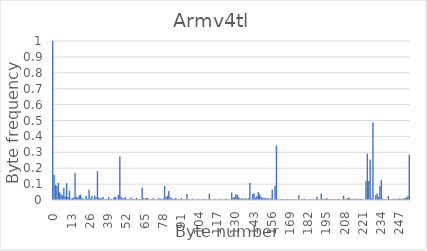
| Category | Series 0 |
|---|---|
| 0.0 | 1 |
| 1.0 | 0.159 |
| 2.0 | 0.095 |
| 3.0 | 0.088 |
| 4.0 | 0.109 |
| 5.0 | 0.049 |
| 6.0 | 0.037 |
| 7.0 | 0.03 |
| 8.0 | 0.077 |
| 9.0 | 0.022 |
| 10.0 | 0.106 |
| 11.0 | 0.02 |
| 12.0 | 0.058 |
| 13.0 | 0.008 |
| 14.0 | 0.012 |
| 15.0 | 0.015 |
| 16.0 | 0.17 |
| 17.0 | 0.021 |
| 18.0 | 0.014 |
| 19.0 | 0.03 |
| 20.0 | 0.033 |
| 21.0 | 0.014 |
| 22.0 | 0.006 |
| 23.0 | 0.006 |
| 24.0 | 0.025 |
| 25.0 | 0.007 |
| 26.0 | 0.064 |
| 27.0 | 0.01 |
| 28.0 | 0.025 |
| 29.0 | 0.005 |
| 30.0 | 0.028 |
| 31.0 | 0.018 |
| 32.0 | 0.181 |
| 33.0 | 0.017 |
| 34.0 | 0.01 |
| 35.0 | 0.01 |
| 36.0 | 0.021 |
| 37.0 | 0.005 |
| 38.0 | 0.005 |
| 39.0 | 0.005 |
| 40.0 | 0.019 |
| 41.0 | 0.005 |
| 42.0 | 0.008 |
| 43.0 | 0.004 |
| 44.0 | 0.019 |
| 45.0 | 0.019 |
| 46.0 | 0.005 |
| 47.0 | 0.033 |
| 48.0 | 0.274 |
| 49.0 | 0.021 |
| 50.0 | 0.011 |
| 51.0 | 0.012 |
| 52.0 | 0.018 |
| 53.0 | 0.006 |
| 54.0 | 0.005 |
| 55.0 | 0.005 |
| 56.0 | 0.016 |
| 57.0 | 0.004 |
| 58.0 | 0.007 |
| 59.0 | 0.004 |
| 60.0 | 0.014 |
| 61.0 | 0.004 |
| 62.0 | 0.005 |
| 63.0 | 0.006 |
| 64.0 | 0.079 |
| 65.0 | 0.011 |
| 66.0 | 0.007 |
| 67.0 | 0.012 |
| 68.0 | 0.012 |
| 69.0 | 0.005 |
| 70.0 | 0.004 |
| 71.0 | 0.006 |
| 72.0 | 0.011 |
| 73.0 | 0.003 |
| 74.0 | 0.003 |
| 75.0 | 0.004 |
| 76.0 | 0.011 |
| 77.0 | 0.009 |
| 78.0 | 0.004 |
| 79.0 | 0.009 |
| 80.0 | 0.089 |
| 81.0 | 0.018 |
| 82.0 | 0.026 |
| 83.0 | 0.056 |
| 84.0 | 0.018 |
| 85.0 | 0.01 |
| 86.0 | 0.008 |
| 87.0 | 0.007 |
| 88.0 | 0.013 |
| 89.0 | 0.005 |
| 90.0 | 0.005 |
| 91.0 | 0.005 |
| 92.0 | 0.012 |
| 93.0 | 0.002 |
| 94.0 | 0.004 |
| 95.0 | 0.003 |
| 96.0 | 0.037 |
| 97.0 | 0.005 |
| 98.0 | 0.003 |
| 99.0 | 0.004 |
| 100.0 | 0.009 |
| 101.0 | 0.003 |
| 102.0 | 0.003 |
| 103.0 | 0.003 |
| 104.0 | 0.008 |
| 105.0 | 0.002 |
| 106.0 | 0.003 |
| 107.0 | 0.003 |
| 108.0 | 0.008 |
| 109.0 | 0.002 |
| 110.0 | 0.002 |
| 111.0 | 0.002 |
| 112.0 | 0.04 |
| 113.0 | 0.004 |
| 114.0 | 0.004 |
| 115.0 | 0.004 |
| 116.0 | 0.008 |
| 117.0 | 0.002 |
| 118.0 | 0.002 |
| 119.0 | 0.002 |
| 120.0 | 0.007 |
| 121.0 | 0.002 |
| 122.0 | 0.002 |
| 123.0 | 0.002 |
| 124.0 | 0.007 |
| 125.0 | 0.002 |
| 126.0 | 0.003 |
| 127.0 | 0.003 |
| 128.0 | 0.047 |
| 129.0 | 0.015 |
| 130.0 | 0.019 |
| 131.0 | 0.035 |
| 132.0 | 0.033 |
| 133.0 | 0.016 |
| 134.0 | 0.011 |
| 135.0 | 0.009 |
| 136.0 | 0.012 |
| 137.0 | 0.006 |
| 138.0 | 0.012 |
| 139.0 | 0.005 |
| 140.0 | 0.011 |
| 141.0 | 0.109 |
| 142.0 | 0.005 |
| 143.0 | 0.037 |
| 144.0 | 0.042 |
| 145.0 | 0.014 |
| 146.0 | 0.025 |
| 147.0 | 0.05 |
| 148.0 | 0.037 |
| 149.0 | 0.02 |
| 150.0 | 0.014 |
| 151.0 | 0.011 |
| 152.0 | 0.015 |
| 153.0 | 0.008 |
| 154.0 | 0.012 |
| 155.0 | 0.007 |
| 156.0 | 0.01 |
| 157.0 | 0.064 |
| 158.0 | 0.005 |
| 159.0 | 0.089 |
| 160.0 | 0.343 |
| 161.0 | 0.005 |
| 162.0 | 0.004 |
| 163.0 | 0.005 |
| 164.0 | 0.007 |
| 165.0 | 0.003 |
| 166.0 | 0.002 |
| 167.0 | 0.003 |
| 168.0 | 0.006 |
| 169.0 | 0.002 |
| 170.0 | 0.004 |
| 171.0 | 0.002 |
| 172.0 | 0.007 |
| 173.0 | 0.002 |
| 174.0 | 0.003 |
| 175.0 | 0.002 |
| 176.0 | 0.029 |
| 177.0 | 0.004 |
| 178.0 | 0.005 |
| 179.0 | 0.005 |
| 180.0 | 0.008 |
| 181.0 | 0.004 |
| 182.0 | 0.004 |
| 183.0 | 0.003 |
| 184.0 | 0.006 |
| 185.0 | 0.002 |
| 186.0 | 0.006 |
| 187.0 | 0.002 |
| 188.0 | 0.006 |
| 189.0 | 0.021 |
| 190.0 | 0.003 |
| 191.0 | 0.003 |
| 192.0 | 0.041 |
| 193.0 | 0.007 |
| 194.0 | 0.007 |
| 195.0 | 0.008 |
| 196.0 | 0.011 |
| 197.0 | 0.005 |
| 198.0 | 0.004 |
| 199.0 | 0.004 |
| 200.0 | 0.007 |
| 201.0 | 0.004 |
| 202.0 | 0.006 |
| 203.0 | 0.004 |
| 204.0 | 0.008 |
| 205.0 | 0.005 |
| 206.0 | 0.004 |
| 207.0 | 0.003 |
| 208.0 | 0.026 |
| 209.0 | 0.006 |
| 210.0 | 0.007 |
| 211.0 | 0.014 |
| 212.0 | 0.013 |
| 213.0 | 0.007 |
| 214.0 | 0.006 |
| 215.0 | 0.005 |
| 216.0 | 0.008 |
| 217.0 | 0.005 |
| 218.0 | 0.008 |
| 219.0 | 0.005 |
| 220.0 | 0.008 |
| 221.0 | 0.004 |
| 222.0 | 0.004 |
| 223.0 | 0.004 |
| 224.0 | 0.119 |
| 225.0 | 0.291 |
| 226.0 | 0.12 |
| 227.0 | 0.255 |
| 228.0 | 0.011 |
| 229.0 | 0.489 |
| 230.0 | 0.004 |
| 231.0 | 0.029 |
| 232.0 | 0.041 |
| 233.0 | 0.02 |
| 234.0 | 0.087 |
| 235.0 | 0.126 |
| 236.0 | 0.007 |
| 237.0 | 0.004 |
| 238.0 | 0.004 |
| 239.0 | 0.005 |
| 240.0 | 0.024 |
| 241.0 | 0.006 |
| 242.0 | 0.005 |
| 243.0 | 0.005 |
| 244.0 | 0.009 |
| 245.0 | 0.005 |
| 246.0 | 0.006 |
| 247.0 | 0.006 |
| 248.0 | 0.01 |
| 249.0 | 0.008 |
| 250.0 | 0.007 |
| 251.0 | 0.01 |
| 252.0 | 0.014 |
| 253.0 | 0.015 |
| 254.0 | 0.025 |
| 255.0 | 0.285 |